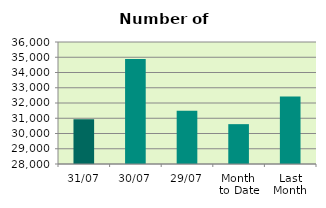
| Category | Series 0 |
|---|---|
| 31/07 | 30928 |
| 30/07 | 34890 |
| 29/07 | 31492 |
| Month 
to Date | 30613.13 |
| Last
Month | 32421.5 |